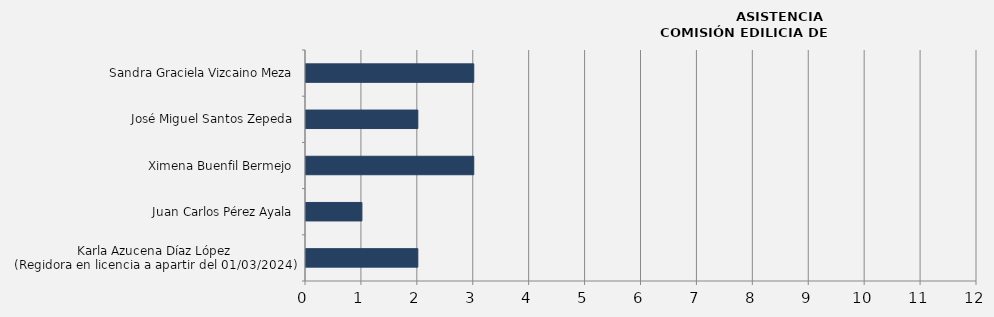
| Category | Series 0 |
|---|---|
| Karla Azucena Díaz López
(Regidora en licencia a apartir del 01/03/2024) | 2 |
| Juan Carlos Pérez Ayala | 1 |
| Ximena Buenfil Bermejo | 3 |
| José Miguel Santos Zepeda | 2 |
| Sandra Graciela Vizcaino Meza | 3 |